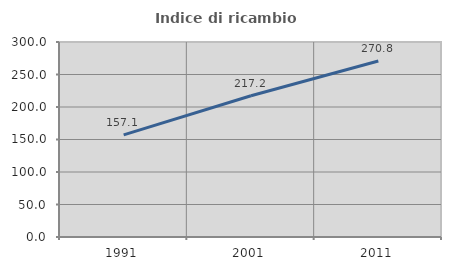
| Category | Indice di ricambio occupazionale  |
|---|---|
| 1991.0 | 157.143 |
| 2001.0 | 217.241 |
| 2011.0 | 270.833 |